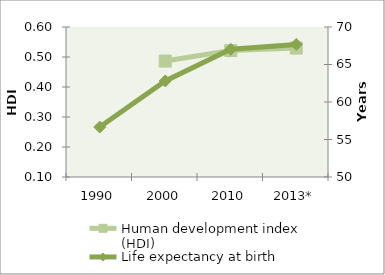
| Category | Human development index (HDI) |
|---|---|
| 1990 | 0 |
| 2000 | 0.486 |
| 2010 | 0.522 |
| 2013* | 0.53 |